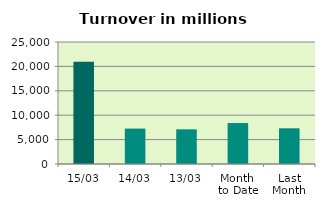
| Category | Series 0 |
|---|---|
| 15/03 | 20955.952 |
| 14/03 | 7251.091 |
| 13/03 | 7102.381 |
| Month 
to Date | 8394.373 |
| Last
Month | 7315.261 |